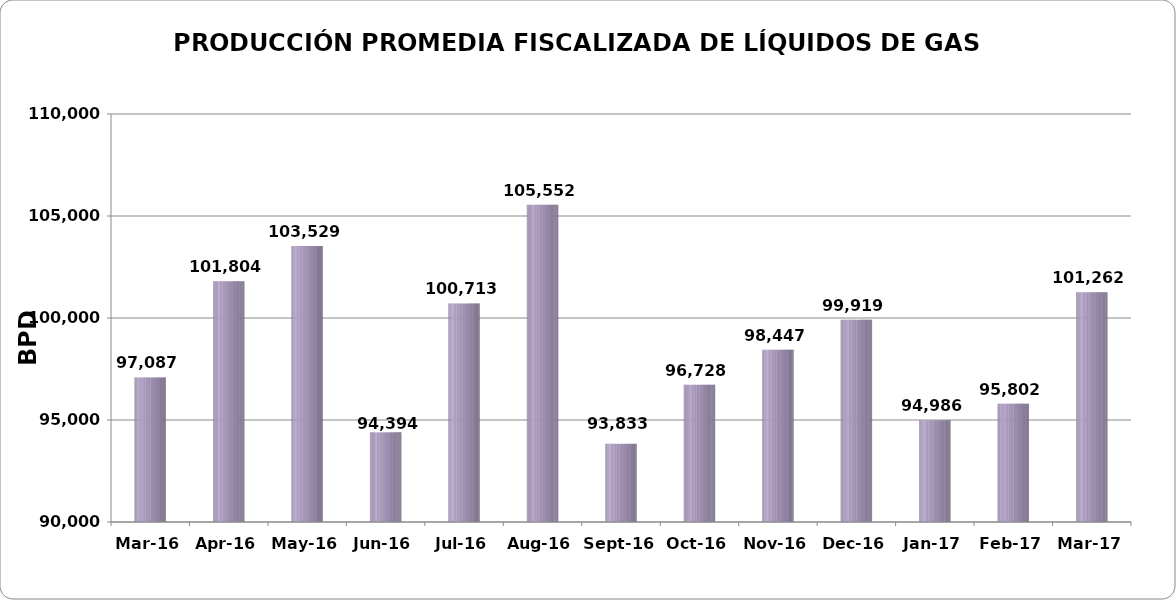
| Category | Series 0 |
|---|---|
| 2016-03-01 | 97087.097 |
| 2016-04-01 | 101803.833 |
| 2016-05-01 | 103529.194 |
| 2016-06-01 | 94393.767 |
| 2016-07-01 | 100713.355 |
| 2016-08-01 | 105552.1 |
| 2016-09-01 | 93833.1 |
| 2016-10-01 | 96727.548 |
| 2016-11-01 | 98446.71 |
| 2016-12-01 | 99919.129 |
| 2017-01-01 | 94986 |
| 2017-02-01 | 95802.107 |
| 2017-03-01 | 101262.286 |